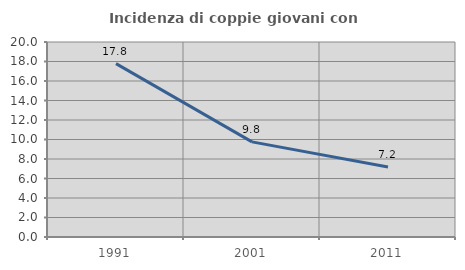
| Category | Incidenza di coppie giovani con figli |
|---|---|
| 1991.0 | 17.778 |
| 2001.0 | 9.756 |
| 2011.0 | 7.182 |